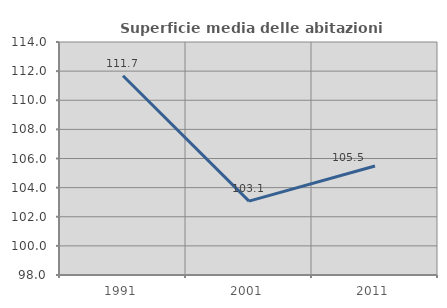
| Category | Superficie media delle abitazioni occupate |
|---|---|
| 1991.0 | 111.684 |
| 2001.0 | 103.073 |
| 2011.0 | 105.485 |